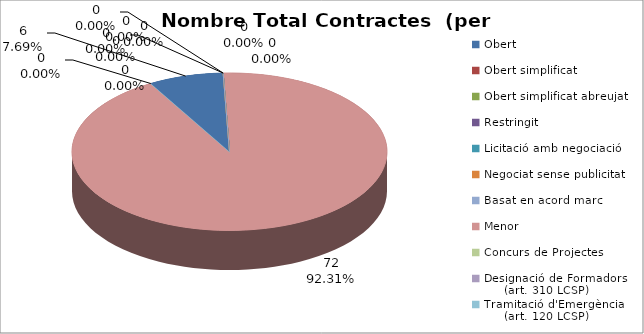
| Category | Nombre Total Contractes |
|---|---|
| Obert | 6 |
| Obert simplificat | 0 |
| Obert simplificat abreujat | 0 |
| Restringit | 0 |
| Licitació amb negociació | 0 |
| Negociat sense publicitat | 0 |
| Basat en acord marc | 0 |
| Menor | 72 |
| Concurs de Projectes | 0 |
| Designació de Formadors
     (art. 310 LCSP) | 0 |
| Tramitació d'Emergència
     (art. 120 LCSP) | 0 |